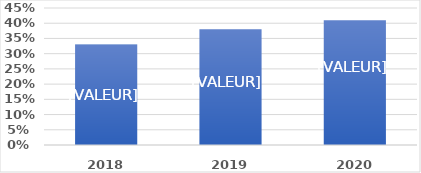
| Category | Évènements ouverts aux scolaires |
|---|---|
| 2018.0 | 0.33 |
| 2019.0 | 0.38 |
| 2020.0 | 0.41 |